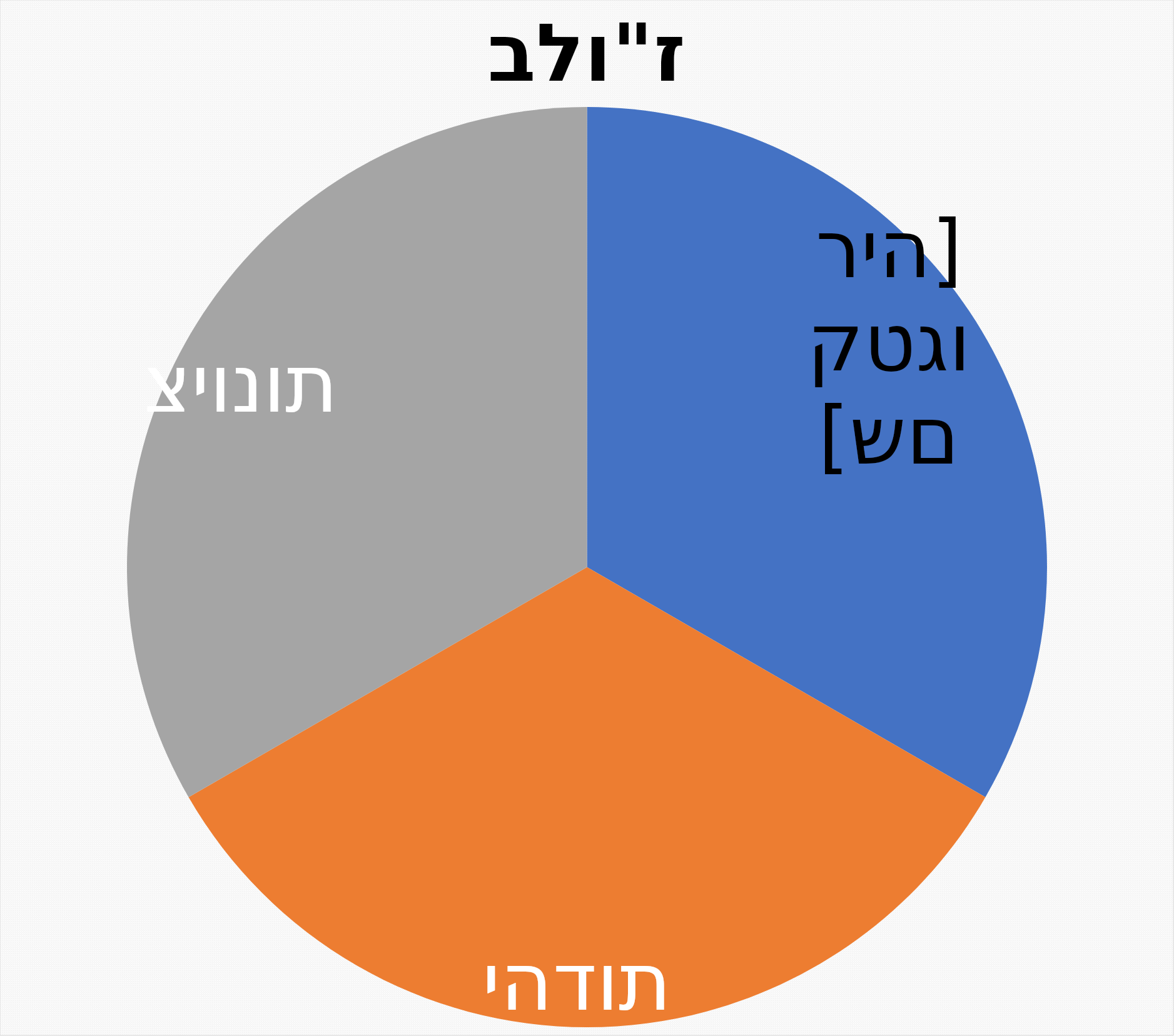
| Category | Series 0 | Series 1 |
|---|---|---|
| פילוסופיה | 10 |  |
| יהדות | 10 |  |
| ציונות | 10 |  |